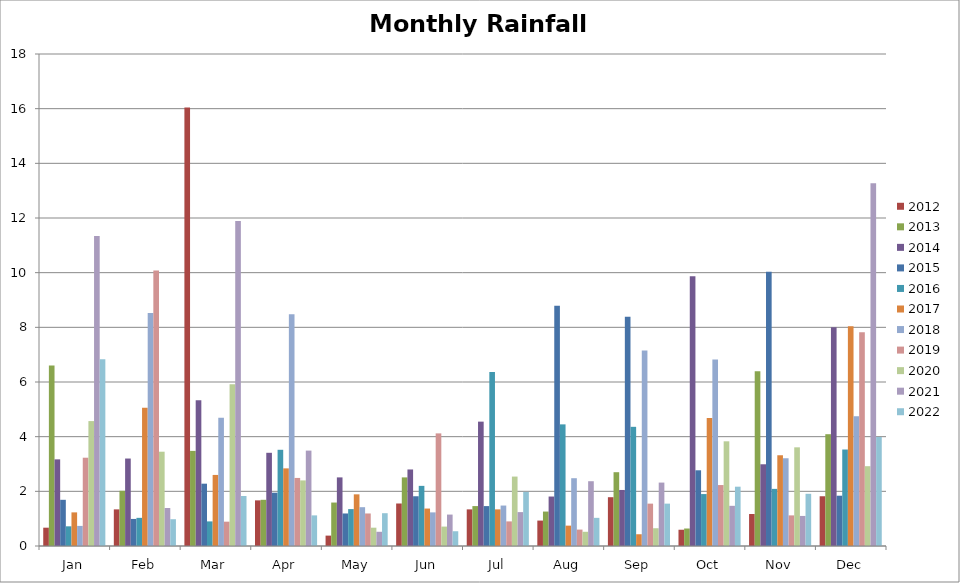
| Category | 2012 | 2013 | 2014 | 2015 | 2016 | 2017 | 2018 | 2019 | 2020 | 2021 | 2022 |
|---|---|---|---|---|---|---|---|---|---|---|---|
| Jan | 0.67 | 6.6 | 3.17 | 1.69 | 0.72 | 1.23 | 0.735 | 3.23 | 4.57 | 11.34 | 6.83 |
| Feb | 1.34 | 2.02 | 3.2 | 0.99 | 1.03 | 5.06 | 8.525 | 10.08 | 3.45 | 1.39 | 0.98 |
| Mar | 16.04 | 3.48 | 5.33 | 2.28 | 0.9 | 2.6 | 4.69 | 0.89 | 5.92 | 11.89 | 1.83 |
| Apr | 1.67 | 1.69 | 3.41 | 1.95 | 3.52 | 2.84 | 8.48 | 2.49 | 2.4 | 3.49 | 1.12 |
| May | 0.38 | 1.59 | 2.51 | 1.19 | 1.35 | 1.89 | 1.42 | 1.19 | 0.67 | 0.52 | 1.2 |
| Jun | 1.555 | 2.51 | 2.8 | 1.82 | 2.2 | 1.37 | 1.23 | 4.12 | 0.71 | 1.15 | 0.54 |
| Jul | 1.34 | 1.46 | 4.55 | 1.46 | 6.37 | 1.34 | 1.48 | 0.9 | 2.54 | 1.24 | 1.98 |
| Aug | 0.93 | 1.26 | 1.81 | 8.79 | 4.45 | 0.745 | 2.48 | 0.6 | 0.52 | 2.37 | 1.03 |
| Sep | 1.785 | 2.7 | 2.05 | 8.39 | 4.36 | 0.43 | 7.15 | 1.55 | 0.65 | 2.32 | 1.55 |
| Oct | 0.595 | 0.64 | 9.87 | 2.77 | 1.9 | 4.685 | 6.82 | 2.23 | 3.83 | 1.47 | 2.17 |
| Nov | 1.17 | 6.39 | 2.99 | 10.03 | 2.09 | 3.32 | 3.21 | 1.12 | 3.61 | 1.1 | 1.91 |
| Dec | 1.82 | 4.09 | 8 | 1.84 | 3.53 | 8.04 | 4.75 | 7.82 | 2.92 | 13.27 | 3.99 |